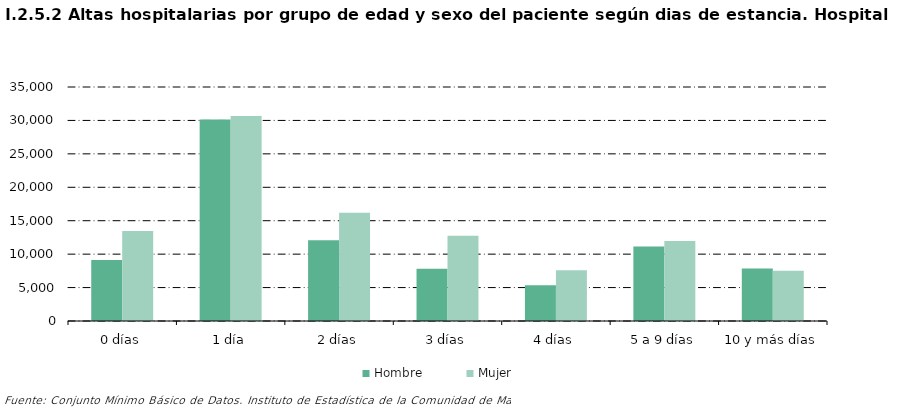
| Category |     Hombre |     Mujer |
|---|---|---|
| 0 | 9136 | 13458 |
| 1 | 30157 | 30681 |
| 2 | 12069 | 16206 |
| 3 | 7801 | 12749 |
| 4 | 5364 | 7580 |
| 5 | 11157 | 11955 |
| 6 | 7863 | 7501 |